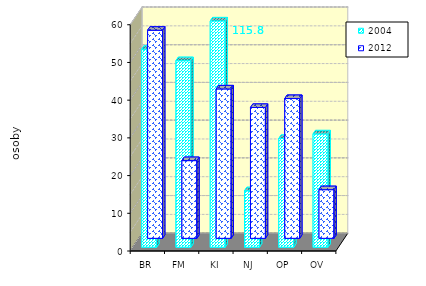
| Category | 2004 | 2012 |
|---|---|---|
| BR | 52.494 | 55.181 |
| FM | 49.461 | 20.609 |
| KI | 115.761 | 39.62 |
| NJ | 14.972 | 34.707 |
| OP | 28.839 | 37.071 |
| OV | 30.048 | 12.903 |